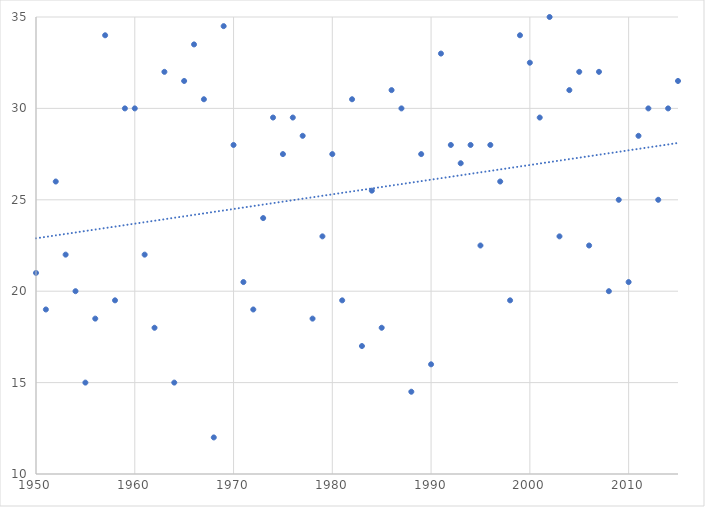
| Category | Series 0 |
|---|---|
| 1950.0 | 21 |
| 1951.0 | 19 |
| 1952.0 | 26 |
| 1953.0 | 22 |
| 1954.0 | 20 |
| 1955.0 | 15 |
| 1956.0 | 18.5 |
| 1957.0 | 34 |
| 1958.0 | 19.5 |
| 1959.0 | 30 |
| 1960.0 | 30 |
| 1961.0 | 22 |
| 1962.0 | 18 |
| 1963.0 | 32 |
| 1964.0 | 15 |
| 1965.0 | 31.5 |
| 1966.0 | 33.5 |
| 1967.0 | 30.5 |
| 1968.0 | 12 |
| 1969.0 | 34.5 |
| 1970.0 | 28 |
| 1971.0 | 20.5 |
| 1972.0 | 19 |
| 1973.0 | 24 |
| 1974.0 | 29.5 |
| 1975.0 | 27.5 |
| 1976.0 | 29.5 |
| 1977.0 | 28.5 |
| 1978.0 | 18.5 |
| 1979.0 | 23 |
| 1980.0 | 27.5 |
| 1981.0 | 19.5 |
| 1982.0 | 30.5 |
| 1983.0 | 17 |
| 1984.0 | 25.5 |
| 1985.0 | 18 |
| 1986.0 | 31 |
| 1987.0 | 30 |
| 1988.0 | 14.5 |
| 1989.0 | 27.5 |
| 1990.0 | 16 |
| 1991.0 | 33 |
| 1992.0 | 28 |
| 1993.0 | 27 |
| 1994.0 | 28 |
| 1995.0 | 22.5 |
| 1996.0 | 28 |
| 1997.0 | 26 |
| 1998.0 | 19.5 |
| 1999.0 | 34 |
| 2000.0 | 32.5 |
| 2001.0 | 29.5 |
| 2002.0 | 35 |
| 2003.0 | 23 |
| 2004.0 | 31 |
| 2005.0 | 32 |
| 2006.0 | 22.5 |
| 2007.0 | 32 |
| 2008.0 | 20 |
| 2009.0 | 25 |
| 2010.0 | 20.5 |
| 2011.0 | 28.5 |
| 2012.0 | 30 |
| 2013.0 | 25 |
| 2014.0 | 30 |
| 2015.0 | 31.5 |